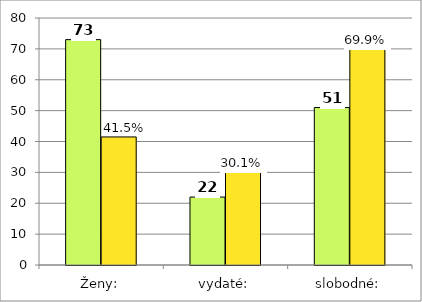
| Category | Series 0 | Series 1 |
|---|---|---|
| Ženy: | 73 | 41.477 |
| vydaté: | 22 | 30.137 |
| slobodné: | 51 | 69.863 |